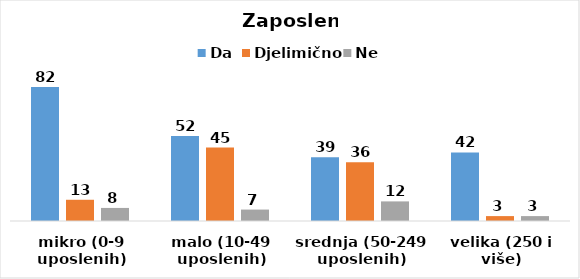
| Category | Da | Djelimično | Ne |
|---|---|---|---|
| mikro (0-9 uposlenih) | 82 | 13 | 8 |
| malo (10-49 uposlenih) | 52 | 45 | 7 |
| srednja (50-249 uposlenih) | 39 | 36 | 12 |
| velika (250 i više) | 42 | 3 | 3 |